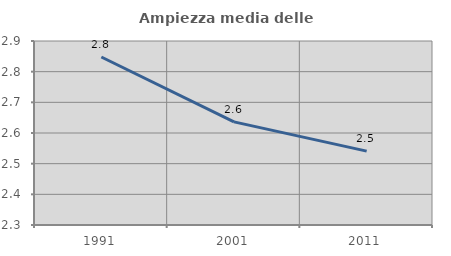
| Category | Ampiezza media delle famiglie |
|---|---|
| 1991.0 | 2.848 |
| 2001.0 | 2.636 |
| 2011.0 | 2.541 |